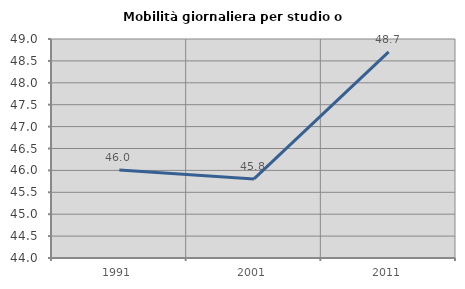
| Category | Mobilità giornaliera per studio o lavoro |
|---|---|
| 1991.0 | 46.009 |
| 2001.0 | 45.805 |
| 2011.0 | 48.706 |